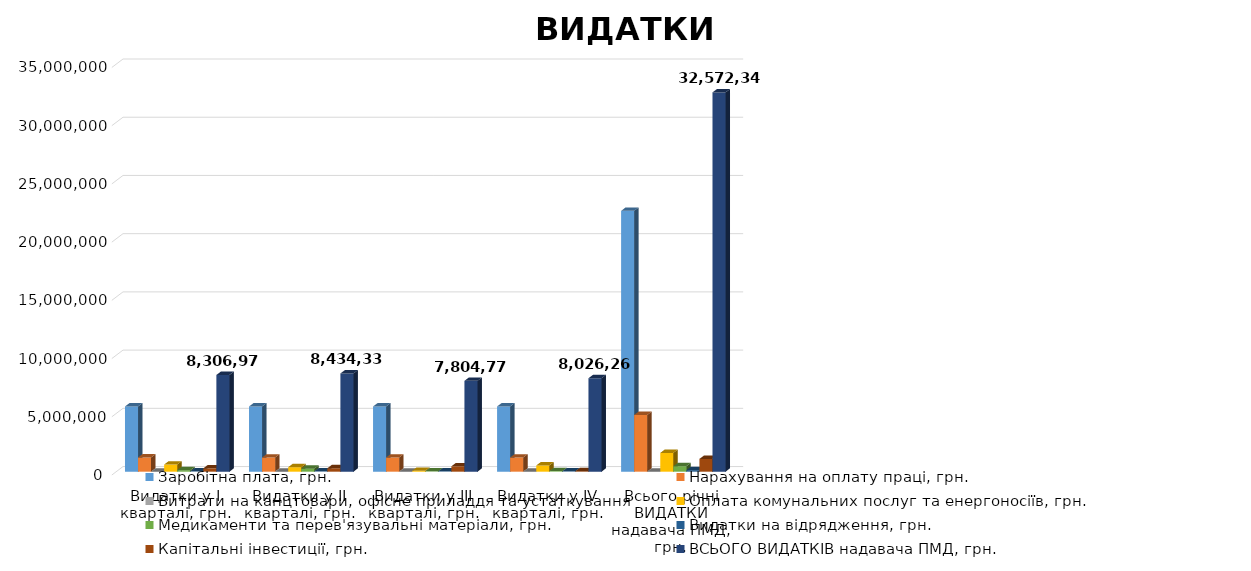
| Category | Заробітна плата, грн. | Нарахування на оплату праці, грн. | Витрати на канцтовари, офісне приладдя та устаткування  | Оплата комунальних послуг та енергоносіїв, грн. | Series 4 | Медикаменти та перев'язувальні матеріали, грн. | Видатки на відрядження, грн. | Капітальні інвестиції, грн. | Series 8 | Series 9 | ВСЬОГО ВИДАТКІВ надавача ПМД, грн. |
|---|---|---|---|---|---|---|---|---|---|---|---|
| Видатки у І кварталі, грн. | 5601915 | 1218426.9 | 0 | 613544.107 |  | 130000 | 33300 | 290000 |  |  | 8306970.757 |
| Видатки у ІІ кварталі, грн. | 5599590 | 1217915.4 | 0 | 386312.336 |  | 260000 | 33300 | 297000 |  |  | 8434332.486 |
| Видатки у ІІІ кварталі, грн. | 5599590 | 1217915.4 | 0 | 79881.73 |  | 30000 | 33300 | 464000 |  |  | 7804771.88 |
| Видатки у IV кварталі, грн. | 5599590 | 1217915.4 | 0 | 533177.098 |  | 50000 | 33300 | 45000 |  |  | 8026267.248 |
| Всього річні ВИДАТКИ надавача ПМД, грн. | 22400685 | 4872173.1 | 0 | 1612915.271 |  | 470000 | 133200 | 1096000 |  |  | 32572342.371 |